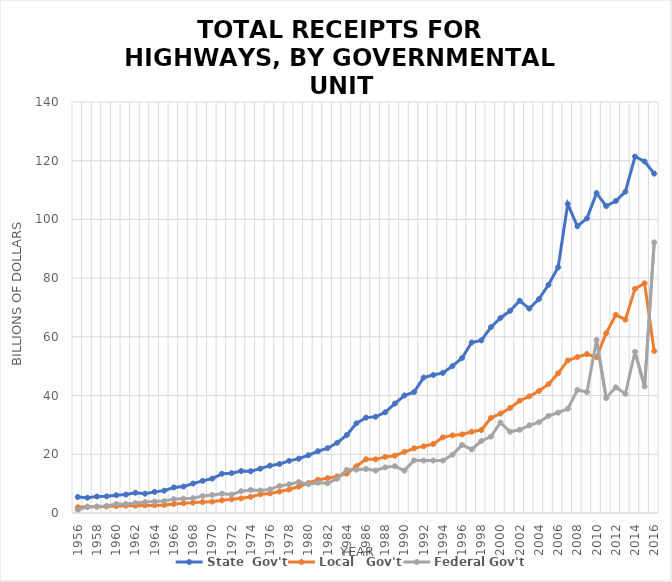
| Category | State  | Local   | Federal |
|---|---|---|---|
| 1956.0 | 5.453 | 1.943 | 1.048 |
| 1957.0 | 5.215 | 2.096 | 2.145 |
| 1958.0 | 5.617 | 2.151 | 2.186 |
| 1959.0 | 5.676 | 2.222 | 2.428 |
| 1960.0 | 6.055 | 2.367 | 3.063 |
| 1961.0 | 6.281 | 2.487 | 3.083 |
| 1962.0 | 6.904 | 2.484 | 3.364 |
| 1963.0 | 6.576 | 2.596 | 3.733 |
| 1964.0 | 7.192 | 2.594 | 3.907 |
| 1965.0 | 7.623 | 2.736 | 4.079 |
| 1966.0 | 8.723 | 3.072 | 4.72 |
| 1967.0 | 9.004 | 3.288 | 4.921 |
| 1968.0 | 10.036 | 3.534 | 5.064 |
| 1969.0 | 10.941 | 3.713 | 5.772 |
| 1970.0 | 11.737 | 3.866 | 6.144 |
| 1971.0 | 13.359 | 4.317 | 6.584 |
| 1972.0 | 13.551 | 4.646 | 6.286 |
| 1973.0 | 14.288 | 4.996 | 7.419 |
| 1974.0 | 14.238 | 5.498 | 7.846 |
| 1975.0 | 15.105 | 6.379 | 7.676 |
| 1976.0 | 16.126 | 6.667 | 8.038 |
| 1977.0 | 16.7 | 7.313 | 9.23 |
| 1978.0 | 17.766 | 7.988 | 9.75 |
| 1979.0 | 18.507 | 9.018 | 10.56 |
| 1980.0 | 19.666 | 10.219 | 9.83 |
| 1981.0 | 21.044 | 11.311 | 10.338 |
| 1982.0 | 22.078 | 11.867 | 10.11 |
| 1983.0 | 23.918 | 12.471 | 11.684 |
| 1984.0 | 26.55 | 13.388 | 14.698 |
| 1985.0 | 30.543 | 15.933 | 14.749 |
| 1986.0 | 32.493 | 18.302 | 14.986 |
| 1987.0 | 32.788 | 18.28 | 14.466 |
| 1988.0 | 34.288 | 19.112 | 15.552 |
| 1989.0 | 37.274 | 19.501 | 15.946 |
| 1990.0 | 40.026 | 20.842 | 14.426 |
| 1991.0 | 41.217 | 22.021 | 17.922 |
| 1992.0 | 46.127 | 22.711 | 17.865 |
| 1993.0 | 47.008 | 23.509 | 17.863 |
| 1994.0 | 47.699 | 25.759 | 17.854 |
| 1995.0 | 50.064 | 26.432 | 19.851 |
| 1996.0 | 52.808 | 26.767 | 23.196 |
| 1997.0 | 58.087 | 27.686 | 21.648 |
| 1998.0 | 58.806 | 28.266 | 24.509 |
| 1999.0 | 63.274 | 32.368 | 26.008 |
| 2000.0 | 66.434 | 33.862 | 30.819 |
| 2001.0 | 68.873 | 35.781 | 27.67 |
| 2002.0 | 72.296 | 38.238 | 28.344 |
| 2003.0 | 69.633 | 39.735 | 29.878 |
| 2004.0 | 72.86 | 41.544 | 30.911 |
| 2005.0 | 77.725 | 43.895 | 33.07 |
| 2006.0 | 83.685 | 47.587 | 34.171 |
| 2007.0 | 105.268 | 51.956 | 35.49 |
| 2008.0 | 97.686 | 53.127 | 41.905 |
| 2009.0 | 100.353 | 54.122 | 41.205 |
| 2010.0 | 108.961 | 53.066 | 58.95 |
| 2011.0 | 104.54 | 61.24 | 39.16 |
| 2012.0 | 106.257 | 67.497 | 42.807 |
| 2013.0 | 109.447 | 65.84 | 40.592 |
| 2014.0 | 121.404 | 76.343 | 54.895 |
| 2015.0 | 119.739 | 78.236 | 43.088 |
| 2016.0 | 115.607 | 55.169 | 92.197 |